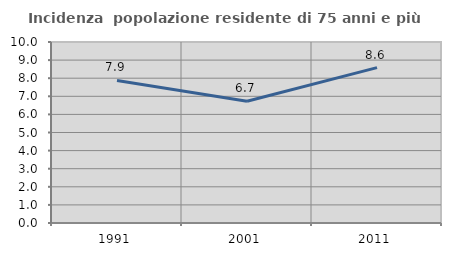
| Category | Incidenza  popolazione residente di 75 anni e più |
|---|---|
| 1991.0 | 7.876 |
| 2001.0 | 6.723 |
| 2011.0 | 8.587 |